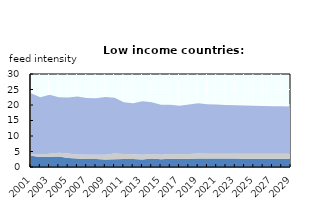
| Category | High protein feed | Medium protein feed | Low protein feed |
|---|---|---|---|
| 2001.0 | 3.637 | 0.551 | 19.635 |
| 2002.0 | 3.249 | 0.766 | 18.481 |
| 2003.0 | 3.304 | 1.009 | 18.954 |
| 2004.0 | 3.421 | 1.151 | 17.906 |
| 2005.0 | 2.919 | 1.454 | 18.041 |
| 2006.0 | 2.763 | 1.273 | 18.674 |
| 2007.0 | 2.609 | 1.327 | 18.337 |
| 2008.0 | 2.596 | 1.349 | 18.269 |
| 2009.0 | 2.437 | 1.492 | 18.635 |
| 2010.0 | 2.471 | 1.892 | 17.949 |
| 2011.0 | 2.62 | 1.576 | 16.726 |
| 2012.0 | 2.567 | 1.57 | 16.402 |
| 2013.0 | 2.426 | 1.505 | 17.317 |
| 2014.0 | 2.75 | 1.456 | 16.66 |
| 2015.0 | 2.518 | 1.44 | 16.149 |
| 2016.0 | 2.688 | 1.476 | 15.885 |
| 2017.0 | 2.603 | 1.512 | 15.669 |
| 2018.0 | 2.637 | 1.535 | 15.974 |
| 2019.0 | 2.739 | 1.582 | 16.269 |
| 2020.0 | 2.713 | 1.562 | 15.952 |
| 2021.0 | 2.708 | 1.558 | 15.856 |
| 2022.0 | 2.704 | 1.555 | 15.779 |
| 2023.0 | 2.703 | 1.55 | 15.684 |
| 2024.0 | 2.699 | 1.547 | 15.596 |
| 2025.0 | 2.696 | 1.547 | 15.517 |
| 2026.0 | 2.696 | 1.549 | 15.448 |
| 2027.0 | 2.694 | 1.55 | 15.381 |
| 2028.0 | 2.692 | 1.551 | 15.318 |
| 2029.0 | 2.692 | 1.554 | 15.267 |